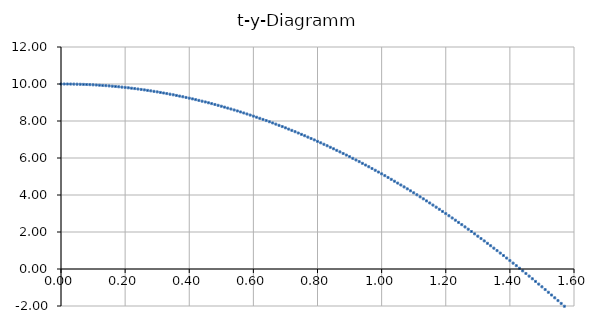
| Category | Series 0 |
|---|---|
| 0.0 | 10 |
| 0.01 | 10 |
| 0.02 | 9.999 |
| 0.03 | 9.997 |
| 0.04 | 9.994 |
| 0.05 | 9.99 |
| 0.06 | 9.985 |
| 0.07 | 9.979 |
| 0.08 | 9.973 |
| 0.09 | 9.965 |
| 0.1 | 9.956 |
| 0.11 | 9.946 |
| 0.12 | 9.935 |
| 0.13 | 9.923 |
| 0.14 | 9.911 |
| 0.15 | 9.897 |
| 0.16 | 9.882 |
| 0.17 | 9.867 |
| 0.18 | 9.85 |
| 0.19 | 9.832 |
| 0.2 | 9.814 |
| 0.21 | 9.794 |
| 0.22 | 9.773 |
| 0.23 | 9.752 |
| 0.24 | 9.729 |
| 0.25 | 9.706 |
| 0.26 | 9.681 |
| 0.27 | 9.656 |
| 0.28 | 9.629 |
| 0.29 | 9.602 |
| 0.3 | 9.573 |
| 0.31 | 9.544 |
| 0.32 | 9.513 |
| 0.33 | 9.482 |
| 0.34 | 9.45 |
| 0.35 | 9.416 |
| 0.36 | 9.382 |
| 0.37 | 9.347 |
| 0.38 | 9.31 |
| 0.39 | 9.273 |
| 0.4 | 9.235 |
| 0.41 | 9.196 |
| 0.42 | 9.155 |
| 0.43 | 9.114 |
| 0.44 | 9.072 |
| 0.45 | 9.029 |
| 0.46 | 8.985 |
| 0.47 | 8.94 |
| 0.48 | 8.893 |
| 0.49 | 8.846 |
| 0.5 | 8.798 |
| 0.51 | 8.749 |
| 0.52 | 8.699 |
| 0.53 | 8.648 |
| 0.54 | 8.596 |
| 0.55 | 8.543 |
| 0.56 | 8.489 |
| 0.57 | 8.434 |
| 0.58 | 8.378 |
| 0.59 | 8.322 |
| 0.6 | 8.264 |
| 0.61 | 8.205 |
| 0.62 | 8.145 |
| 0.63 | 8.084 |
| 0.64 | 8.022 |
| 0.65 | 7.96 |
| 0.66 | 7.896 |
| 0.67 | 7.831 |
| 0.68 | 7.765 |
| 0.69 | 7.699 |
| 0.7 | 7.631 |
| 0.71 | 7.562 |
| 0.72 | 7.493 |
| 0.73 | 7.422 |
| 0.74 | 7.35 |
| 0.75 | 7.278 |
| 0.76 | 7.204 |
| 0.77 | 7.13 |
| 0.78 | 7.054 |
| 0.790000000000001 | 6.978 |
| 0.8 | 6.9 |
| 0.810000000000001 | 6.822 |
| 0.82 | 6.742 |
| 0.83 | 6.662 |
| 0.84 | 6.58 |
| 0.850000000000001 | 6.498 |
| 0.860000000000001 | 6.414 |
| 0.87 | 6.33 |
| 0.88 | 6.245 |
| 0.890000000000001 | 6.158 |
| 0.900000000000001 | 6.071 |
| 0.910000000000001 | 5.983 |
| 0.92 | 5.894 |
| 0.930000000000001 | 5.803 |
| 0.940000000000001 | 5.712 |
| 0.950000000000001 | 5.62 |
| 0.960000000000001 | 5.527 |
| 0.970000000000001 | 5.432 |
| 0.980000000000001 | 5.337 |
| 0.990000000000001 | 5.241 |
| 1.0 | 5.144 |
| 1.01 | 5.046 |
| 1.02 | 4.947 |
| 1.03 | 4.847 |
| 1.04 | 4.746 |
| 1.05 | 4.644 |
| 1.06 | 4.541 |
| 1.07 | 4.437 |
| 1.08 | 4.332 |
| 1.09 | 4.226 |
| 1.1 | 4.119 |
| 1.11 | 4.011 |
| 1.12 | 3.902 |
| 1.13 | 3.792 |
| 1.14 | 3.681 |
| 1.15 | 3.57 |
| 1.16 | 3.457 |
| 1.17 | 3.343 |
| 1.18 | 3.228 |
| 1.19 | 3.112 |
| 1.2 | 2.996 |
| 1.21 | 2.878 |
| 1.22 | 2.759 |
| 1.23 | 2.64 |
| 1.24 | 2.519 |
| 1.25 | 2.397 |
| 1.26 | 2.275 |
| 1.27 | 2.151 |
| 1.28 | 2.026 |
| 1.29 | 1.901 |
| 1.3 | 1.774 |
| 1.31 | 1.647 |
| 1.32 | 1.518 |
| 1.33 | 1.389 |
| 1.34 | 1.258 |
| 1.35 | 1.127 |
| 1.36 | 0.994 |
| 1.37 | 0.861 |
| 1.38 | 0.727 |
| 1.39 | 0.591 |
| 1.4 | 0.455 |
| 1.41 | 0.318 |
| 1.42 | 0.179 |
| 1.43 | 0.04 |
| 1.44 | -0.1 |
| 1.45 | -0.242 |
| 1.46 | -0.384 |
| 1.47 | -0.527 |
| 1.48 | -0.671 |
| 1.49 | -0.817 |
| 1.5 | -0.963 |
| 1.51 | -1.11 |
| 1.52 | -1.258 |
| 1.53 | -1.407 |
| 1.54 | -1.557 |
| 1.55 | -1.708 |
| 1.56 | -1.86 |
| 1.57 | -2.013 |
| 1.58 | -2.167 |
| 1.59 | -2.322 |
| 1.6 | -2.478 |